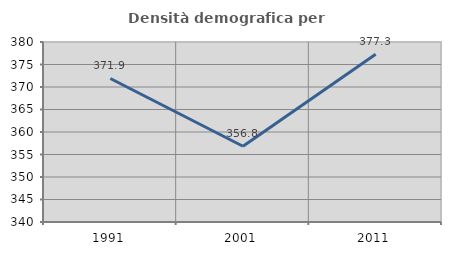
| Category | Densità demografica |
|---|---|
| 1991.0 | 371.897 |
| 2001.0 | 356.84 |
| 2011.0 | 377.279 |